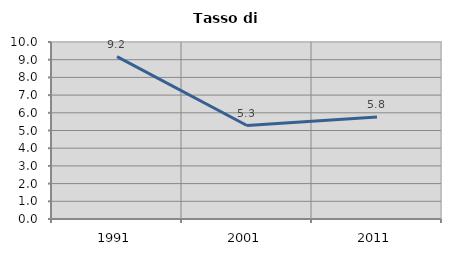
| Category | Tasso di disoccupazione   |
|---|---|
| 1991.0 | 9.174 |
| 2001.0 | 5.281 |
| 2011.0 | 5.76 |